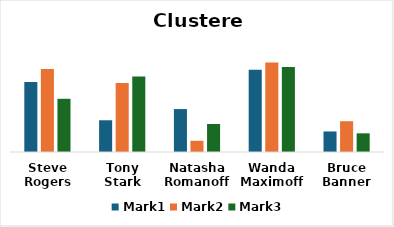
| Category | Mark1 | Mark2 | Mark3 |
|---|---|---|---|
| Steve Rogers | 75 | 89 | 57 |
| Tony Stark | 34 | 74 | 81 |
| Natasha Romanoff | 46 | 12 | 30 |
| Wanda Maximoff | 88 | 96 | 91 |
| Bruce Banner | 22 | 33 | 20 |